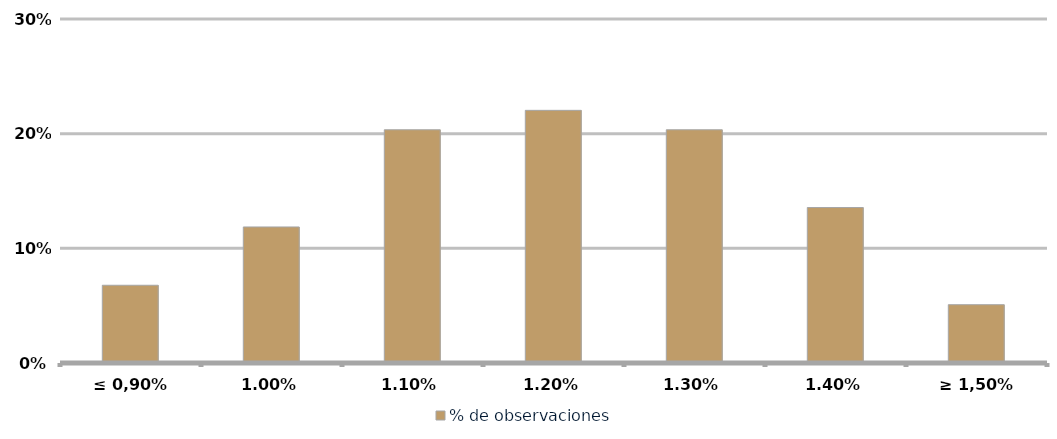
| Category | % de observaciones  |
|---|---|
| ≤ 0,90% | 0.068 |
| 1,00% | 0.119 |
| 1,10% | 0.203 |
| 1,20% | 0.22 |
| 1,30% | 0.203 |
| 1,40% | 0.136 |
| ≥ 1,50% | 0.051 |